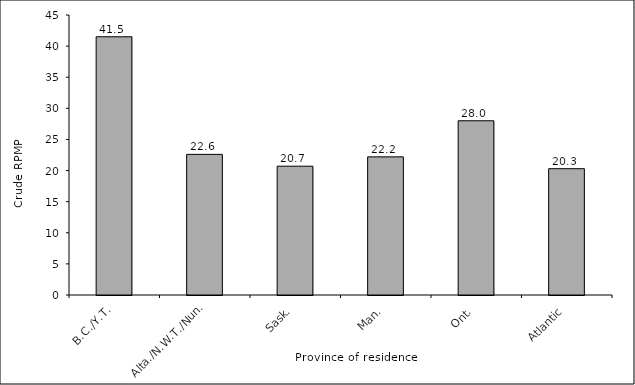
| Category | Crude RPMP |
|---|---|
| B.C./Y.T. | 41.5 |
| Alta./N.W.T./Nun. | 22.6 |
| Sask. | 20.7 |
| Man. | 22.2 |
| Ont. | 28 |
| Atlantic | 20.3 |